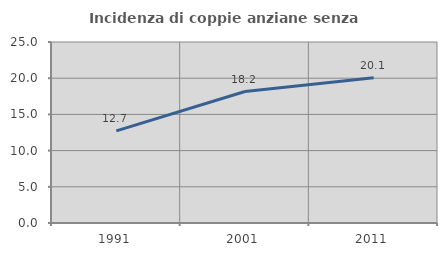
| Category | Incidenza di coppie anziane senza figli  |
|---|---|
| 1991.0 | 12.723 |
| 2001.0 | 18.156 |
| 2011.0 | 20.072 |